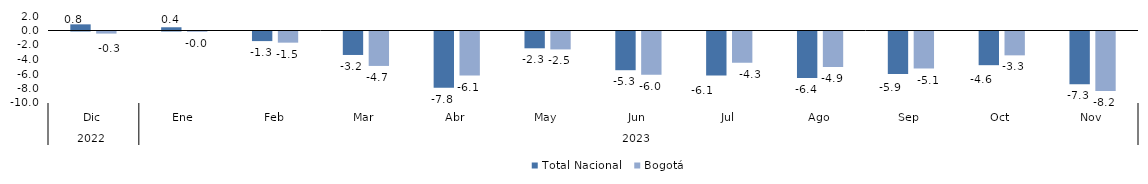
| Category | Total Nacional | Bogotá |
|---|---|---|
| 0 | 0.848 | -0.288 |
| 1 | 0.446 | -0.036 |
| 2 | -1.323 | -1.54 |
| 3 | -3.237 | -4.748 |
| 4 | -7.775 | -6.083 |
| 5 | -2.317 | -2.47 |
| 6 | -5.338 | -5.973 |
| 7 | -6.073 | -4.31 |
| 8 | -6.427 | -4.897 |
| 9 | -5.868 | -5.102 |
| 10 | -4.647 | -3.29 |
| 11 | -7.26 | -8.19 |